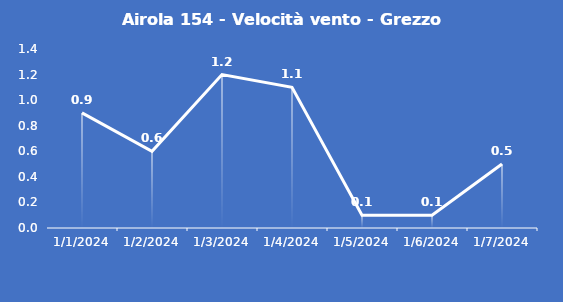
| Category | Airola 154 - Velocità vento - Grezzo (m/s) |
|---|---|
| 1/1/24 | 0.9 |
| 1/2/24 | 0.6 |
| 1/3/24 | 1.2 |
| 1/4/24 | 1.1 |
| 1/5/24 | 0.1 |
| 1/6/24 | 0.1 |
| 1/7/24 | 0.5 |